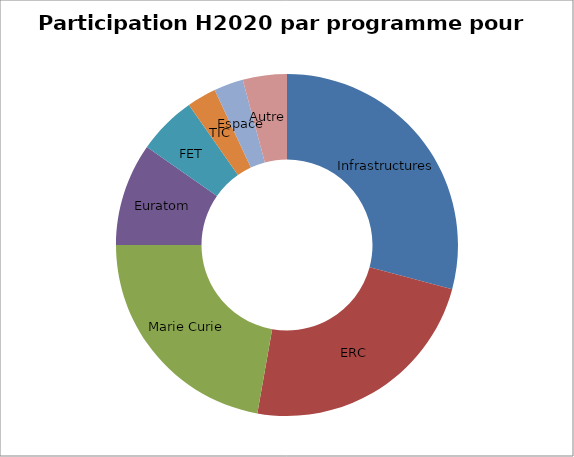
| Category | Series 0 |
|---|---|
| Infrastructures | 21 |
| ERC | 17 |
| Marie Curie | 16 |
| Euratom | 7 |
| FET  | 4 |
| TIC | 2 |
| Espace | 2 |
| Autre | 3 |